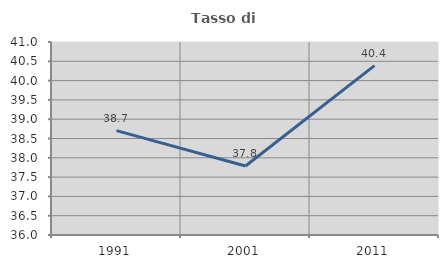
| Category | Tasso di occupazione   |
|---|---|
| 1991.0 | 38.703 |
| 2001.0 | 37.786 |
| 2011.0 | 40.39 |